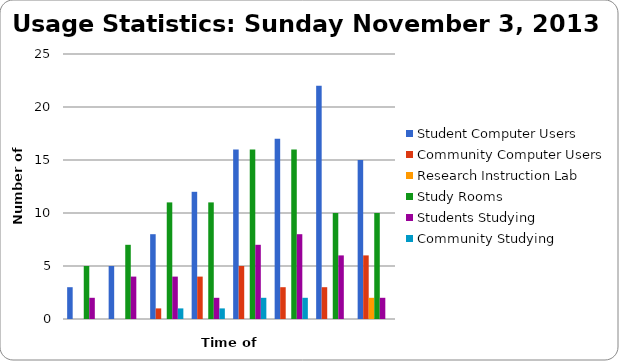
| Category | Student Computer Users | Community Computer Users | Research Instruction Lab | Study Rooms | Students Studying | Community Studying |
|---|---|---|---|---|---|---|
| 10 am | 3 | 0 | 0 | 5 | 2 | 0 |
| 11 am | 5 | 0 | 0 | 7 | 4 | 0 |
| 12 pm | 8 | 1 | 0 | 11 | 4 | 1 |
| 1 pm | 12 | 4 | 0 | 11 | 2 | 1 |
| 2 pm | 16 | 5 | 0 | 16 | 7 | 2 |
| 3 pm | 17 | 3 | 0 | 16 | 8 | 2 |
| 4 pm | 22 | 3 | 0 | 10 | 6 | 0 |
| 5 pm | 15 | 6 | 2 | 10 | 2 | 0 |